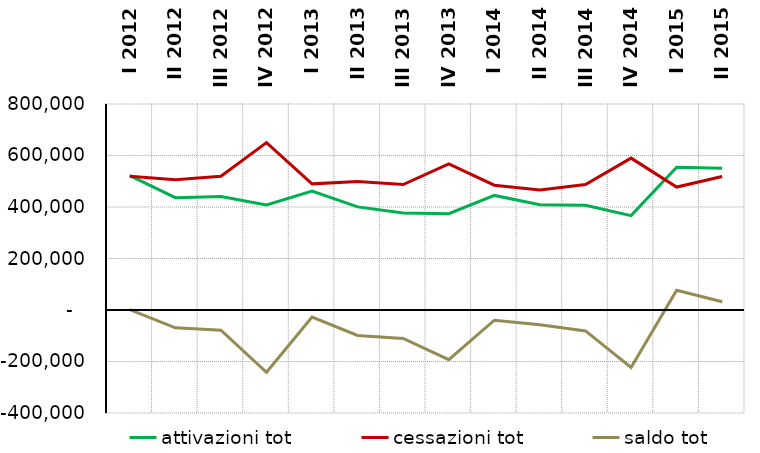
| Category | attivazioni tot | cessazioni tot | saldo tot |
|---|---|---|---|
| I 2012 | 521657 | 519810 | 1847 |
| II 2012 | 436288 | 505370 | -69082 |
| III 2012 | 440935 | 519525 | -78590 |
| IV 2012 | 408269 | 649967 | -241698 |
| I 2013 | 462113 | 489821 | -27708 |
| II 2013 | 400368 | 499306 | -98938 |
| III 2013 | 376949 | 487367 | -110418 |
| IV 2013 | 374141 | 567151 | -193010 |
| I 2014 | 444980 | 484613 | -39633 |
| II 2014 | 408792 | 466067 | -57275 |
| III 2014 | 406399 | 487649 | -81250 |
| IV 2014 | 366399 | 589805 | -223406 |
| I 2015 | 554324 | 477401 | 76923 |
| II 2015 | 550115 | 518279 | 31836 |